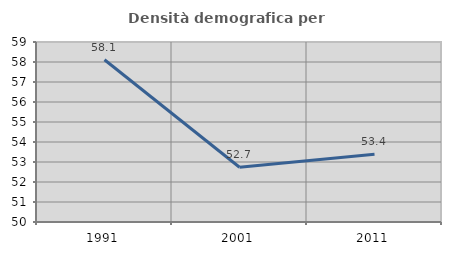
| Category | Densità demografica |
|---|---|
| 1991.0 | 58.112 |
| 2001.0 | 52.736 |
| 2011.0 | 53.385 |